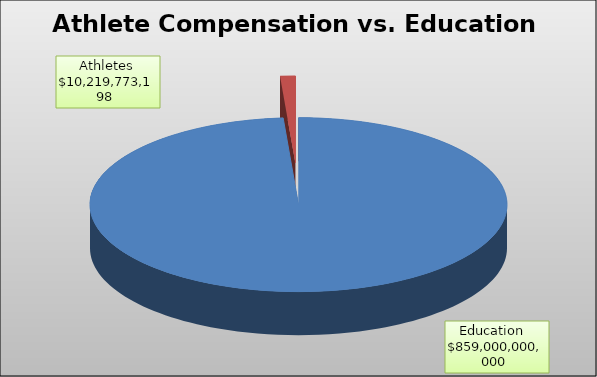
| Category | Series 0 |
|---|---|
| Education  | 859000000000 |
| Athletes | 10219773198 |